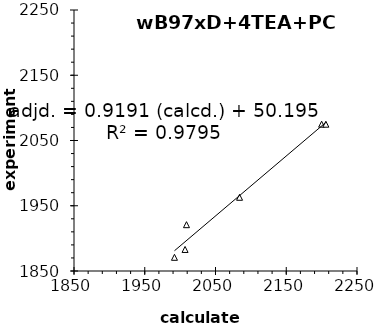
| Category | wB97xD |
|---|---|
| 1992.0 | 1871 |
| 2007.0 | 1883 |
| 2009.0 | 1921 |
| 2084.0 | 1963 |
| 2200.0 | 2075 |
| 2206.0 | 2075 |